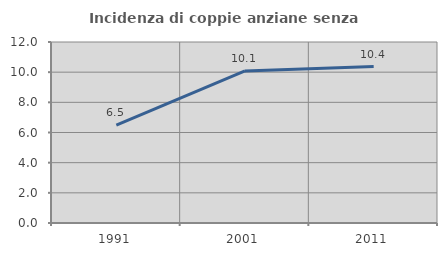
| Category | Incidenza di coppie anziane senza figli  |
|---|---|
| 1991.0 | 6.485 |
| 2001.0 | 10.081 |
| 2011.0 | 10.369 |